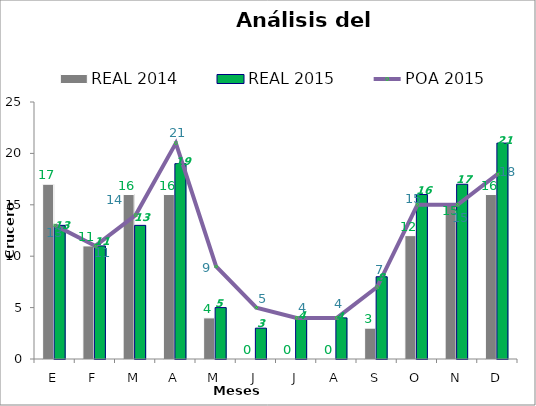
| Category | REAL 2014 | REAL 2015 |
|---|---|---|
| E | 17 | 13 |
| F | 11 | 11 |
| M | 16 | 13 |
| A | 16 | 19 |
| M | 4 | 5 |
| J | 0 | 3 |
| J | 0 | 4 |
| A | 0 | 4 |
| S | 3 | 8 |
| O | 12 | 16 |
| N | 15 | 17 |
| D | 16 | 21 |